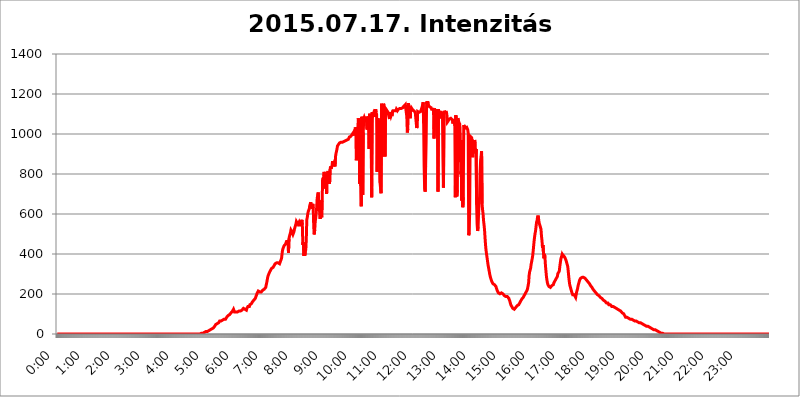
| Category | 2015.07.17. Intenzitás [W/m^2] |
|---|---|
| 0.0 | 0 |
| 0.0006944444444444445 | 0 |
| 0.001388888888888889 | 0 |
| 0.0020833333333333333 | 0 |
| 0.002777777777777778 | 0 |
| 0.003472222222222222 | 0 |
| 0.004166666666666667 | 0 |
| 0.004861111111111111 | 0 |
| 0.005555555555555556 | 0 |
| 0.0062499999999999995 | 0 |
| 0.006944444444444444 | 0 |
| 0.007638888888888889 | 0 |
| 0.008333333333333333 | 0 |
| 0.009027777777777779 | 0 |
| 0.009722222222222222 | 0 |
| 0.010416666666666666 | 0 |
| 0.011111111111111112 | 0 |
| 0.011805555555555555 | 0 |
| 0.012499999999999999 | 0 |
| 0.013194444444444444 | 0 |
| 0.013888888888888888 | 0 |
| 0.014583333333333332 | 0 |
| 0.015277777777777777 | 0 |
| 0.015972222222222224 | 0 |
| 0.016666666666666666 | 0 |
| 0.017361111111111112 | 0 |
| 0.018055555555555557 | 0 |
| 0.01875 | 0 |
| 0.019444444444444445 | 0 |
| 0.02013888888888889 | 0 |
| 0.020833333333333332 | 0 |
| 0.02152777777777778 | 0 |
| 0.022222222222222223 | 0 |
| 0.02291666666666667 | 0 |
| 0.02361111111111111 | 0 |
| 0.024305555555555556 | 0 |
| 0.024999999999999998 | 0 |
| 0.025694444444444447 | 0 |
| 0.02638888888888889 | 0 |
| 0.027083333333333334 | 0 |
| 0.027777777777777776 | 0 |
| 0.02847222222222222 | 0 |
| 0.029166666666666664 | 0 |
| 0.029861111111111113 | 0 |
| 0.030555555555555555 | 0 |
| 0.03125 | 0 |
| 0.03194444444444445 | 0 |
| 0.03263888888888889 | 0 |
| 0.03333333333333333 | 0 |
| 0.034027777777777775 | 0 |
| 0.034722222222222224 | 0 |
| 0.035416666666666666 | 0 |
| 0.036111111111111115 | 0 |
| 0.03680555555555556 | 0 |
| 0.0375 | 0 |
| 0.03819444444444444 | 0 |
| 0.03888888888888889 | 0 |
| 0.03958333333333333 | 0 |
| 0.04027777777777778 | 0 |
| 0.04097222222222222 | 0 |
| 0.041666666666666664 | 0 |
| 0.042361111111111106 | 0 |
| 0.04305555555555556 | 0 |
| 0.043750000000000004 | 0 |
| 0.044444444444444446 | 0 |
| 0.04513888888888889 | 0 |
| 0.04583333333333334 | 0 |
| 0.04652777777777778 | 0 |
| 0.04722222222222222 | 0 |
| 0.04791666666666666 | 0 |
| 0.04861111111111111 | 0 |
| 0.049305555555555554 | 0 |
| 0.049999999999999996 | 0 |
| 0.05069444444444445 | 0 |
| 0.051388888888888894 | 0 |
| 0.052083333333333336 | 0 |
| 0.05277777777777778 | 0 |
| 0.05347222222222222 | 0 |
| 0.05416666666666667 | 0 |
| 0.05486111111111111 | 0 |
| 0.05555555555555555 | 0 |
| 0.05625 | 0 |
| 0.05694444444444444 | 0 |
| 0.057638888888888885 | 0 |
| 0.05833333333333333 | 0 |
| 0.05902777777777778 | 0 |
| 0.059722222222222225 | 0 |
| 0.06041666666666667 | 0 |
| 0.061111111111111116 | 0 |
| 0.06180555555555556 | 0 |
| 0.0625 | 0 |
| 0.06319444444444444 | 0 |
| 0.06388888888888888 | 0 |
| 0.06458333333333334 | 0 |
| 0.06527777777777778 | 0 |
| 0.06597222222222222 | 0 |
| 0.06666666666666667 | 0 |
| 0.06736111111111111 | 0 |
| 0.06805555555555555 | 0 |
| 0.06874999999999999 | 0 |
| 0.06944444444444443 | 0 |
| 0.07013888888888889 | 0 |
| 0.07083333333333333 | 0 |
| 0.07152777777777779 | 0 |
| 0.07222222222222223 | 0 |
| 0.07291666666666667 | 0 |
| 0.07361111111111111 | 0 |
| 0.07430555555555556 | 0 |
| 0.075 | 0 |
| 0.07569444444444444 | 0 |
| 0.0763888888888889 | 0 |
| 0.07708333333333334 | 0 |
| 0.07777777777777778 | 0 |
| 0.07847222222222222 | 0 |
| 0.07916666666666666 | 0 |
| 0.0798611111111111 | 0 |
| 0.08055555555555556 | 0 |
| 0.08125 | 0 |
| 0.08194444444444444 | 0 |
| 0.08263888888888889 | 0 |
| 0.08333333333333333 | 0 |
| 0.08402777777777777 | 0 |
| 0.08472222222222221 | 0 |
| 0.08541666666666665 | 0 |
| 0.08611111111111112 | 0 |
| 0.08680555555555557 | 0 |
| 0.08750000000000001 | 0 |
| 0.08819444444444445 | 0 |
| 0.08888888888888889 | 0 |
| 0.08958333333333333 | 0 |
| 0.09027777777777778 | 0 |
| 0.09097222222222222 | 0 |
| 0.09166666666666667 | 0 |
| 0.09236111111111112 | 0 |
| 0.09305555555555556 | 0 |
| 0.09375 | 0 |
| 0.09444444444444444 | 0 |
| 0.09513888888888888 | 0 |
| 0.09583333333333333 | 0 |
| 0.09652777777777777 | 0 |
| 0.09722222222222222 | 0 |
| 0.09791666666666667 | 0 |
| 0.09861111111111111 | 0 |
| 0.09930555555555555 | 0 |
| 0.09999999999999999 | 0 |
| 0.10069444444444443 | 0 |
| 0.1013888888888889 | 0 |
| 0.10208333333333335 | 0 |
| 0.10277777777777779 | 0 |
| 0.10347222222222223 | 0 |
| 0.10416666666666667 | 0 |
| 0.10486111111111111 | 0 |
| 0.10555555555555556 | 0 |
| 0.10625 | 0 |
| 0.10694444444444444 | 0 |
| 0.1076388888888889 | 0 |
| 0.10833333333333334 | 0 |
| 0.10902777777777778 | 0 |
| 0.10972222222222222 | 0 |
| 0.1111111111111111 | 0 |
| 0.11180555555555556 | 0 |
| 0.11180555555555556 | 0 |
| 0.1125 | 0 |
| 0.11319444444444444 | 0 |
| 0.11388888888888889 | 0 |
| 0.11458333333333333 | 0 |
| 0.11527777777777777 | 0 |
| 0.11597222222222221 | 0 |
| 0.11666666666666665 | 0 |
| 0.1173611111111111 | 0 |
| 0.11805555555555557 | 0 |
| 0.11944444444444445 | 0 |
| 0.12013888888888889 | 0 |
| 0.12083333333333333 | 0 |
| 0.12152777777777778 | 0 |
| 0.12222222222222223 | 0 |
| 0.12291666666666667 | 0 |
| 0.12291666666666667 | 0 |
| 0.12361111111111112 | 0 |
| 0.12430555555555556 | 0 |
| 0.125 | 0 |
| 0.12569444444444444 | 0 |
| 0.12638888888888888 | 0 |
| 0.12708333333333333 | 0 |
| 0.16875 | 0 |
| 0.12847222222222224 | 0 |
| 0.12916666666666668 | 0 |
| 0.12986111111111112 | 0 |
| 0.13055555555555556 | 0 |
| 0.13125 | 0 |
| 0.13194444444444445 | 0 |
| 0.1326388888888889 | 0 |
| 0.13333333333333333 | 0 |
| 0.13402777777777777 | 0 |
| 0.13402777777777777 | 0 |
| 0.13472222222222222 | 0 |
| 0.13541666666666666 | 0 |
| 0.1361111111111111 | 0 |
| 0.13749999999999998 | 0 |
| 0.13819444444444443 | 0 |
| 0.1388888888888889 | 0 |
| 0.13958333333333334 | 0 |
| 0.14027777777777778 | 0 |
| 0.14097222222222222 | 0 |
| 0.14166666666666666 | 0 |
| 0.1423611111111111 | 0 |
| 0.14305555555555557 | 0 |
| 0.14375000000000002 | 0 |
| 0.14444444444444446 | 0 |
| 0.1451388888888889 | 0 |
| 0.1451388888888889 | 0 |
| 0.14652777777777778 | 0 |
| 0.14722222222222223 | 0 |
| 0.14791666666666667 | 0 |
| 0.1486111111111111 | 0 |
| 0.14930555555555555 | 0 |
| 0.15 | 0 |
| 0.15069444444444444 | 0 |
| 0.15138888888888888 | 0 |
| 0.15208333333333332 | 0 |
| 0.15277777777777776 | 0 |
| 0.15347222222222223 | 0 |
| 0.15416666666666667 | 0 |
| 0.15486111111111112 | 0 |
| 0.15555555555555556 | 0 |
| 0.15625 | 0 |
| 0.15694444444444444 | 0 |
| 0.15763888888888888 | 0 |
| 0.15833333333333333 | 0 |
| 0.15902777777777777 | 0 |
| 0.15972222222222224 | 0 |
| 0.16041666666666668 | 0 |
| 0.16111111111111112 | 0 |
| 0.16180555555555556 | 0 |
| 0.1625 | 0 |
| 0.16319444444444445 | 0 |
| 0.1638888888888889 | 0 |
| 0.16458333333333333 | 0 |
| 0.16527777777777777 | 0 |
| 0.16597222222222222 | 0 |
| 0.16666666666666666 | 0 |
| 0.1673611111111111 | 0 |
| 0.16805555555555554 | 0 |
| 0.16874999999999998 | 0 |
| 0.16944444444444443 | 0 |
| 0.17013888888888887 | 0 |
| 0.1708333333333333 | 0 |
| 0.17152777777777775 | 0 |
| 0.17222222222222225 | 0 |
| 0.1729166666666667 | 0 |
| 0.17361111111111113 | 0 |
| 0.17430555555555557 | 0 |
| 0.17500000000000002 | 0 |
| 0.17569444444444446 | 0 |
| 0.1763888888888889 | 0 |
| 0.17708333333333334 | 0 |
| 0.17777777777777778 | 0 |
| 0.17847222222222223 | 0 |
| 0.17916666666666667 | 0 |
| 0.1798611111111111 | 0 |
| 0.18055555555555555 | 0 |
| 0.18125 | 0 |
| 0.18194444444444444 | 0 |
| 0.1826388888888889 | 0 |
| 0.18333333333333335 | 0 |
| 0.1840277777777778 | 0 |
| 0.18472222222222223 | 0 |
| 0.18541666666666667 | 0 |
| 0.18611111111111112 | 0 |
| 0.18680555555555556 | 0 |
| 0.1875 | 0 |
| 0.18819444444444444 | 0 |
| 0.18888888888888888 | 0 |
| 0.18958333333333333 | 0 |
| 0.19027777777777777 | 0 |
| 0.1909722222222222 | 0 |
| 0.19166666666666665 | 0 |
| 0.19236111111111112 | 0 |
| 0.19305555555555554 | 0 |
| 0.19375 | 0 |
| 0.19444444444444445 | 0 |
| 0.1951388888888889 | 0 |
| 0.19583333333333333 | 0 |
| 0.19652777777777777 | 0 |
| 0.19722222222222222 | 0 |
| 0.19791666666666666 | 0 |
| 0.1986111111111111 | 0 |
| 0.19930555555555554 | 0 |
| 0.19999999999999998 | 0 |
| 0.20069444444444443 | 0 |
| 0.20138888888888887 | 3.525 |
| 0.2020833333333333 | 3.525 |
| 0.2027777777777778 | 3.525 |
| 0.2034722222222222 | 3.525 |
| 0.2041666666666667 | 3.525 |
| 0.20486111111111113 | 3.525 |
| 0.20555555555555557 | 7.887 |
| 0.20625000000000002 | 7.887 |
| 0.20694444444444446 | 7.887 |
| 0.2076388888888889 | 7.887 |
| 0.20833333333333334 | 12.257 |
| 0.20902777777777778 | 12.257 |
| 0.20972222222222223 | 12.257 |
| 0.21041666666666667 | 12.257 |
| 0.2111111111111111 | 16.636 |
| 0.21180555555555555 | 16.636 |
| 0.2125 | 16.636 |
| 0.21319444444444444 | 16.636 |
| 0.2138888888888889 | 21.024 |
| 0.21458333333333335 | 21.024 |
| 0.2152777777777778 | 21.024 |
| 0.21597222222222223 | 21.024 |
| 0.21666666666666667 | 25.419 |
| 0.21736111111111112 | 25.419 |
| 0.21805555555555556 | 29.823 |
| 0.21875 | 29.823 |
| 0.21944444444444444 | 34.234 |
| 0.22013888888888888 | 34.234 |
| 0.22083333333333333 | 38.653 |
| 0.22152777777777777 | 43.079 |
| 0.2222222222222222 | 47.511 |
| 0.22291666666666665 | 47.511 |
| 0.2236111111111111 | 47.511 |
| 0.22430555555555556 | 51.951 |
| 0.225 | 51.951 |
| 0.22569444444444445 | 56.398 |
| 0.2263888888888889 | 56.398 |
| 0.22708333333333333 | 60.85 |
| 0.22777777777777777 | 65.31 |
| 0.22847222222222222 | 65.31 |
| 0.22916666666666666 | 65.31 |
| 0.2298611111111111 | 65.31 |
| 0.23055555555555554 | 65.31 |
| 0.23124999999999998 | 65.31 |
| 0.23194444444444443 | 69.775 |
| 0.23263888888888887 | 69.775 |
| 0.2333333333333333 | 69.775 |
| 0.2340277777777778 | 74.246 |
| 0.2347222222222222 | 74.246 |
| 0.2354166666666667 | 74.246 |
| 0.23611111111111113 | 74.246 |
| 0.23680555555555557 | 78.722 |
| 0.23750000000000002 | 83.205 |
| 0.23819444444444446 | 83.205 |
| 0.2388888888888889 | 87.692 |
| 0.23958333333333334 | 92.184 |
| 0.24027777777777778 | 92.184 |
| 0.24097222222222223 | 92.184 |
| 0.24166666666666667 | 96.682 |
| 0.2423611111111111 | 96.682 |
| 0.24305555555555555 | 101.184 |
| 0.24375 | 105.69 |
| 0.24444444444444446 | 105.69 |
| 0.24513888888888888 | 110.201 |
| 0.24583333333333335 | 114.716 |
| 0.2465277777777778 | 119.235 |
| 0.24722222222222223 | 123.758 |
| 0.24791666666666667 | 119.235 |
| 0.24861111111111112 | 110.201 |
| 0.24930555555555556 | 114.716 |
| 0.25 | 114.716 |
| 0.25069444444444444 | 110.201 |
| 0.2513888888888889 | 114.716 |
| 0.2520833333333333 | 114.716 |
| 0.25277777777777777 | 110.201 |
| 0.2534722222222222 | 110.201 |
| 0.25416666666666665 | 114.716 |
| 0.2548611111111111 | 114.716 |
| 0.2555555555555556 | 114.716 |
| 0.25625000000000003 | 114.716 |
| 0.2569444444444445 | 114.716 |
| 0.2576388888888889 | 114.716 |
| 0.25833333333333336 | 114.716 |
| 0.2590277777777778 | 119.235 |
| 0.25972222222222224 | 119.235 |
| 0.2604166666666667 | 123.758 |
| 0.2611111111111111 | 128.284 |
| 0.26180555555555557 | 128.284 |
| 0.2625 | 128.284 |
| 0.26319444444444445 | 123.758 |
| 0.2638888888888889 | 119.235 |
| 0.26458333333333334 | 119.235 |
| 0.2652777777777778 | 119.235 |
| 0.2659722222222222 | 128.284 |
| 0.26666666666666666 | 132.814 |
| 0.2673611111111111 | 137.347 |
| 0.26805555555555555 | 137.347 |
| 0.26875 | 137.347 |
| 0.26944444444444443 | 137.347 |
| 0.2701388888888889 | 146.423 |
| 0.2708333333333333 | 146.423 |
| 0.27152777777777776 | 146.423 |
| 0.2722222222222222 | 150.964 |
| 0.27291666666666664 | 155.509 |
| 0.2736111111111111 | 160.056 |
| 0.2743055555555555 | 164.605 |
| 0.27499999999999997 | 164.605 |
| 0.27569444444444446 | 169.156 |
| 0.27638888888888885 | 173.709 |
| 0.27708333333333335 | 173.709 |
| 0.2777777777777778 | 178.264 |
| 0.27847222222222223 | 182.82 |
| 0.2791666666666667 | 191.937 |
| 0.2798611111111111 | 196.497 |
| 0.28055555555555556 | 205.62 |
| 0.28125 | 210.182 |
| 0.28194444444444444 | 214.746 |
| 0.2826388888888889 | 214.746 |
| 0.2833333333333333 | 214.746 |
| 0.28402777777777777 | 210.182 |
| 0.2847222222222222 | 205.62 |
| 0.28541666666666665 | 205.62 |
| 0.28611111111111115 | 210.182 |
| 0.28680555555555554 | 210.182 |
| 0.28750000000000003 | 210.182 |
| 0.2881944444444445 | 219.309 |
| 0.2888888888888889 | 219.309 |
| 0.28958333333333336 | 219.309 |
| 0.2902777777777778 | 223.873 |
| 0.29097222222222224 | 223.873 |
| 0.2916666666666667 | 223.873 |
| 0.2923611111111111 | 233 |
| 0.29305555555555557 | 233 |
| 0.29375 | 255.813 |
| 0.29444444444444445 | 269.49 |
| 0.2951388888888889 | 283.156 |
| 0.29583333333333334 | 292.259 |
| 0.2965277777777778 | 296.808 |
| 0.2972222222222222 | 287.709 |
| 0.29791666666666666 | 310.44 |
| 0.2986111111111111 | 314.98 |
| 0.29930555555555555 | 319.517 |
| 0.3 | 319.517 |
| 0.30069444444444443 | 328.584 |
| 0.3013888888888889 | 328.584 |
| 0.3020833333333333 | 333.113 |
| 0.30277777777777776 | 333.113 |
| 0.3034722222222222 | 337.639 |
| 0.30416666666666664 | 342.162 |
| 0.3048611111111111 | 346.682 |
| 0.3055555555555555 | 351.198 |
| 0.30624999999999997 | 351.198 |
| 0.3069444444444444 | 355.712 |
| 0.3076388888888889 | 355.712 |
| 0.30833333333333335 | 351.198 |
| 0.3090277777777778 | 351.198 |
| 0.30972222222222223 | 355.712 |
| 0.3104166666666667 | 355.712 |
| 0.3111111111111111 | 355.712 |
| 0.31180555555555556 | 351.198 |
| 0.3125 | 355.712 |
| 0.31319444444444444 | 364.728 |
| 0.3138888888888889 | 364.728 |
| 0.3145833333333333 | 378.224 |
| 0.31527777777777777 | 400.638 |
| 0.3159722222222222 | 418.492 |
| 0.31666666666666665 | 427.39 |
| 0.31736111111111115 | 431.833 |
| 0.31805555555555554 | 440.702 |
| 0.31875000000000003 | 440.702 |
| 0.3194444444444445 | 445.129 |
| 0.3201388888888889 | 449.551 |
| 0.32083333333333336 | 453.968 |
| 0.3215277777777778 | 462.786 |
| 0.32222222222222224 | 462.786 |
| 0.3229166666666667 | 467.187 |
| 0.3236111111111111 | 462.786 |
| 0.32430555555555557 | 405.108 |
| 0.325 | 475.972 |
| 0.32569444444444445 | 489.108 |
| 0.3263888888888889 | 484.735 |
| 0.32708333333333334 | 506.542 |
| 0.3277777777777778 | 519.555 |
| 0.3284722222222222 | 519.555 |
| 0.32916666666666666 | 510.885 |
| 0.3298611111111111 | 506.542 |
| 0.33055555555555555 | 497.836 |
| 0.33125 | 502.192 |
| 0.33194444444444443 | 510.885 |
| 0.3326388888888889 | 523.88 |
| 0.3333333333333333 | 532.513 |
| 0.3340277777777778 | 541.121 |
| 0.3347222222222222 | 549.704 |
| 0.3354166666666667 | 562.53 |
| 0.3361111111111111 | 562.53 |
| 0.3368055555555556 | 566.793 |
| 0.33749999999999997 | 549.704 |
| 0.33819444444444446 | 549.704 |
| 0.33888888888888885 | 558.261 |
| 0.33958333333333335 | 545.416 |
| 0.34027777777777773 | 545.416 |
| 0.34097222222222223 | 541.121 |
| 0.3416666666666666 | 545.416 |
| 0.3423611111111111 | 558.261 |
| 0.3430555555555555 | 571.049 |
| 0.34375 | 545.416 |
| 0.3444444444444445 | 445.129 |
| 0.3451388888888889 | 458.38 |
| 0.3458333333333334 | 391.685 |
| 0.34652777777777777 | 400.638 |
| 0.34722222222222227 | 391.685 |
| 0.34791666666666665 | 409.574 |
| 0.34861111111111115 | 422.943 |
| 0.34930555555555554 | 475.972 |
| 0.35000000000000003 | 571.049 |
| 0.3506944444444444 | 583.779 |
| 0.3513888888888889 | 600.661 |
| 0.3520833333333333 | 613.252 |
| 0.3527777777777778 | 613.252 |
| 0.3534722222222222 | 625.784 |
| 0.3541666666666667 | 642.4 |
| 0.3548611111111111 | 642.4 |
| 0.35555555555555557 | 658.909 |
| 0.35625 | 634.105 |
| 0.35694444444444445 | 642.4 |
| 0.3576388888888889 | 625.784 |
| 0.35833333333333334 | 650.667 |
| 0.3590277777777778 | 629.948 |
| 0.3597222222222222 | 536.82 |
| 0.36041666666666666 | 497.836 |
| 0.3611111111111111 | 519.555 |
| 0.36180555555555555 | 562.53 |
| 0.3625 | 579.542 |
| 0.36319444444444443 | 604.864 |
| 0.3638888888888889 | 634.105 |
| 0.3645833333333333 | 679.395 |
| 0.3652777777777778 | 675.311 |
| 0.3659722222222222 | 707.8 |
| 0.3666666666666667 | 667.123 |
| 0.3673611111111111 | 634.105 |
| 0.3680555555555556 | 609.062 |
| 0.36874999999999997 | 575.299 |
| 0.36944444444444446 | 667.123 |
| 0.37013888888888885 | 671.22 |
| 0.37083333333333335 | 583.779 |
| 0.37152777777777773 | 663.019 |
| 0.37222222222222223 | 775.492 |
| 0.3729166666666666 | 775.492 |
| 0.3736111111111111 | 783.342 |
| 0.3743055555555555 | 810.641 |
| 0.375 | 771.559 |
| 0.3756944444444445 | 727.896 |
| 0.3763888888888889 | 798.974 |
| 0.3770833333333334 | 759.723 |
| 0.37777777777777777 | 699.717 |
| 0.37847222222222227 | 798.974 |
| 0.37916666666666665 | 806.757 |
| 0.37986111111111115 | 814.519 |
| 0.38055555555555554 | 751.803 |
| 0.38125000000000003 | 802.868 |
| 0.3819444444444444 | 751.803 |
| 0.3826388888888889 | 822.26 |
| 0.3833333333333333 | 837.682 |
| 0.3840277777777778 | 826.123 |
| 0.3847222222222222 | 833.834 |
| 0.3854166666666667 | 841.526 |
| 0.3861111111111111 | 864.493 |
| 0.38680555555555557 | 864.493 |
| 0.3875 | 853.029 |
| 0.38819444444444445 | 849.199 |
| 0.3888888888888889 | 849.199 |
| 0.38958333333333334 | 837.682 |
| 0.3902777777777778 | 887.309 |
| 0.3909722222222222 | 902.447 |
| 0.39166666666666666 | 913.766 |
| 0.3923611111111111 | 925.06 |
| 0.39305555555555555 | 940.082 |
| 0.39375 | 943.832 |
| 0.39444444444444443 | 947.58 |
| 0.3951388888888889 | 951.327 |
| 0.3958333333333333 | 955.071 |
| 0.3965277777777778 | 955.071 |
| 0.3972222222222222 | 958.814 |
| 0.3979166666666667 | 958.814 |
| 0.3986111111111111 | 958.814 |
| 0.3993055555555556 | 958.814 |
| 0.39999999999999997 | 958.814 |
| 0.40069444444444446 | 962.555 |
| 0.40138888888888885 | 962.555 |
| 0.40208333333333335 | 962.555 |
| 0.40277777777777773 | 962.555 |
| 0.40347222222222223 | 962.555 |
| 0.4041666666666666 | 966.295 |
| 0.4048611111111111 | 966.295 |
| 0.4055555555555555 | 970.034 |
| 0.40625 | 970.034 |
| 0.4069444444444445 | 970.034 |
| 0.4076388888888889 | 973.772 |
| 0.4083333333333334 | 973.772 |
| 0.40902777777777777 | 977.508 |
| 0.40972222222222227 | 984.98 |
| 0.41041666666666665 | 984.98 |
| 0.41111111111111115 | 988.714 |
| 0.41180555555555554 | 988.714 |
| 0.41250000000000003 | 992.448 |
| 0.4131944444444444 | 992.448 |
| 0.4138888888888889 | 999.916 |
| 0.4145833333333333 | 999.916 |
| 0.4152777777777778 | 1007.383 |
| 0.4159722222222222 | 1007.383 |
| 0.4166666666666667 | 992.448 |
| 0.4173611111111111 | 1014.852 |
| 0.41805555555555557 | 1033.537 |
| 0.41875 | 1026.06 |
| 0.41944444444444445 | 868.305 |
| 0.4201388888888889 | 894.885 |
| 0.42083333333333334 | 992.448 |
| 0.4215277777777778 | 1007.383 |
| 0.4222222222222222 | 1078.555 |
| 0.42291666666666666 | 1059.756 |
| 0.4236111111111111 | 1071.027 |
| 0.42430555555555555 | 751.803 |
| 0.425 | 1056.004 |
| 0.42569444444444443 | 739.877 |
| 0.4263888888888889 | 638.256 |
| 0.4270833333333333 | 1086.097 |
| 0.4277777777777778 | 1067.267 |
| 0.4284722222222222 | 695.666 |
| 0.4291666666666667 | 1007.383 |
| 0.4298611111111111 | 1074.789 |
| 0.4305555555555556 | 1082.324 |
| 0.43124999999999997 | 1074.789 |
| 0.43194444444444446 | 1074.789 |
| 0.43263888888888885 | 1059.756 |
| 0.43333333333333335 | 1086.097 |
| 0.43402777777777773 | 1082.324 |
| 0.43472222222222223 | 1022.323 |
| 0.4354166666666666 | 1086.097 |
| 0.4361111111111111 | 1074.789 |
| 0.4368055555555555 | 1086.097 |
| 0.4375 | 925.06 |
| 0.4381944444444445 | 1101.226 |
| 0.4388888888888889 | 977.508 |
| 0.4395833333333334 | 1048.508 |
| 0.44027777777777777 | 1071.027 |
| 0.44097222222222227 | 683.473 |
| 0.44166666666666665 | 1108.816 |
| 0.44236111111111115 | 1105.019 |
| 0.44305555555555554 | 1097.437 |
| 0.44375000000000003 | 1105.019 |
| 0.4444444444444444 | 1108.816 |
| 0.4451388888888889 | 1105.019 |
| 0.4458333333333333 | 1086.097 |
| 0.4465277777777778 | 1124.056 |
| 0.4472222222222222 | 1108.816 |
| 0.4479166666666667 | 1097.437 |
| 0.4486111111111111 | 810.641 |
| 0.44930555555555557 | 1041.019 |
| 0.45 | 1078.555 |
| 0.45069444444444445 | 1056.004 |
| 0.4513888888888889 | 864.493 |
| 0.45208333333333334 | 1014.852 |
| 0.4527777777777778 | 755.766 |
| 0.4534722222222222 | 727.896 |
| 0.45416666666666666 | 703.762 |
| 0.4548611111111111 | 1150.946 |
| 0.45555555555555555 | 887.309 |
| 0.45625 | 1048.508 |
| 0.45694444444444443 | 1139.384 |
| 0.4576388888888889 | 1150.946 |
| 0.4583333333333333 | 1143.232 |
| 0.4590277777777778 | 1135.543 |
| 0.4597222222222222 | 887.309 |
| 0.4604166666666667 | 1127.879 |
| 0.4611111111111111 | 1124.056 |
| 0.4618055555555556 | 1101.226 |
| 0.46249999999999997 | 1116.426 |
| 0.46319444444444446 | 1112.618 |
| 0.46388888888888885 | 1108.816 |
| 0.46458333333333335 | 1108.816 |
| 0.46527777777777773 | 1105.019 |
| 0.46597222222222223 | 1074.789 |
| 0.4666666666666666 | 1108.816 |
| 0.4673611111111111 | 1112.618 |
| 0.4680555555555555 | 1089.873 |
| 0.46875 | 1097.437 |
| 0.4694444444444445 | 1089.873 |
| 0.4701388888888889 | 1108.816 |
| 0.4708333333333334 | 1116.426 |
| 0.47152777777777777 | 1116.426 |
| 0.47222222222222227 | 1116.426 |
| 0.47291666666666665 | 1116.426 |
| 0.47361111111111115 | 1112.618 |
| 0.47430555555555554 | 1112.618 |
| 0.47500000000000003 | 1116.426 |
| 0.4756944444444444 | 1124.056 |
| 0.4763888888888889 | 1120.238 |
| 0.4770833333333333 | 1116.426 |
| 0.4777777777777778 | 1116.426 |
| 0.4784722222222222 | 1124.056 |
| 0.4791666666666667 | 1124.056 |
| 0.4798611111111111 | 1124.056 |
| 0.48055555555555557 | 1127.879 |
| 0.48125 | 1131.708 |
| 0.48194444444444445 | 1131.708 |
| 0.4826388888888889 | 1127.879 |
| 0.48333333333333334 | 1131.708 |
| 0.4840277777777778 | 1131.708 |
| 0.4847222222222222 | 1131.708 |
| 0.48541666666666666 | 1135.543 |
| 0.4861111111111111 | 1139.384 |
| 0.48680555555555555 | 1139.384 |
| 0.4875 | 1143.232 |
| 0.48819444444444443 | 1147.086 |
| 0.4888888888888889 | 1147.086 |
| 0.4895833333333333 | 1150.946 |
| 0.4902777777777778 | 1086.097 |
| 0.4909722222222222 | 1007.383 |
| 0.4916666666666667 | 1026.06 |
| 0.4923611111111111 | 1154.814 |
| 0.4930555555555556 | 1131.708 |
| 0.49374999999999997 | 1120.238 |
| 0.49444444444444446 | 1105.019 |
| 0.49513888888888885 | 1078.555 |
| 0.49583333333333335 | 1124.056 |
| 0.49652777777777773 | 1131.708 |
| 0.49722222222222223 | 1131.708 |
| 0.4979166666666666 | 1124.056 |
| 0.4986111111111111 | 1120.238 |
| 0.4993055555555555 | 1120.238 |
| 0.5 | 1116.426 |
| 0.5006944444444444 | 1112.618 |
| 0.5013888888888889 | 1116.426 |
| 0.5020833333333333 | 1108.816 |
| 0.5027777777777778 | 1108.816 |
| 0.5034722222222222 | 1105.019 |
| 0.5041666666666667 | 1029.798 |
| 0.5048611111111111 | 1041.019 |
| 0.5055555555555555 | 1112.618 |
| 0.50625 | 1116.426 |
| 0.5069444444444444 | 1112.618 |
| 0.5076388888888889 | 1108.816 |
| 0.5083333333333333 | 1108.816 |
| 0.5090277777777777 | 1112.618 |
| 0.5097222222222222 | 1112.618 |
| 0.5104166666666666 | 1112.618 |
| 0.5111111111111112 | 1127.879 |
| 0.5118055555555555 | 1135.543 |
| 0.5125000000000001 | 1135.543 |
| 0.5131944444444444 | 1158.689 |
| 0.513888888888889 | 1052.255 |
| 0.5145833333333333 | 837.682 |
| 0.5152777777777778 | 727.896 |
| 0.5159722222222222 | 711.832 |
| 0.5166666666666667 | 837.682 |
| 0.517361111111111 | 962.555 |
| 0.5180555555555556 | 1162.571 |
| 0.5187499999999999 | 1150.946 |
| 0.5194444444444445 | 1162.571 |
| 0.5201388888888888 | 1154.814 |
| 0.5208333333333334 | 1143.232 |
| 0.5215277777777778 | 1139.384 |
| 0.5222222222222223 | 1135.543 |
| 0.5229166666666667 | 1135.543 |
| 0.5236111111111111 | 1139.384 |
| 0.5243055555555556 | 1131.708 |
| 0.525 | 1124.056 |
| 0.5256944444444445 | 1127.879 |
| 0.5263888888888889 | 1124.056 |
| 0.5270833333333333 | 1124.056 |
| 0.5277777777777778 | 1116.426 |
| 0.5284722222222222 | 977.508 |
| 0.5291666666666667 | 1127.879 |
| 0.5298611111111111 | 1097.437 |
| 0.5305555555555556 | 1124.056 |
| 0.53125 | 1097.437 |
| 0.5319444444444444 | 1067.267 |
| 0.5326388888888889 | 999.916 |
| 0.5333333333333333 | 988.714 |
| 0.5340277777777778 | 711.832 |
| 0.5347222222222222 | 1124.056 |
| 0.5354166666666667 | 1127.879 |
| 0.5361111111111111 | 1078.555 |
| 0.5368055555555555 | 1108.816 |
| 0.5375 | 1108.816 |
| 0.5381944444444444 | 1112.618 |
| 0.5388888888888889 | 1108.816 |
| 0.5395833333333333 | 1105.019 |
| 0.5402777777777777 | 1101.226 |
| 0.5409722222222222 | 872.114 |
| 0.5416666666666666 | 731.896 |
| 0.5423611111111112 | 1097.437 |
| 0.5430555555555555 | 1116.426 |
| 0.5437500000000001 | 1108.816 |
| 0.5444444444444444 | 1105.019 |
| 0.545138888888889 | 1105.019 |
| 0.5458333333333333 | 1108.816 |
| 0.5465277777777778 | 1093.653 |
| 0.5472222222222222 | 1059.756 |
| 0.5479166666666667 | 1059.756 |
| 0.548611111111111 | 1067.267 |
| 0.5493055555555556 | 1063.51 |
| 0.5499999999999999 | 1074.789 |
| 0.5506944444444445 | 1078.555 |
| 0.5513888888888888 | 1078.555 |
| 0.5520833333333334 | 1078.555 |
| 0.5527777777777778 | 1074.789 |
| 0.5534722222222223 | 1074.789 |
| 0.5541666666666667 | 1071.027 |
| 0.5548611111111111 | 1052.255 |
| 0.5555555555555556 | 1059.756 |
| 0.55625 | 1063.51 |
| 0.5569444444444445 | 1074.789 |
| 0.5576388888888889 | 1041.019 |
| 0.5583333333333333 | 683.473 |
| 0.5590277777777778 | 1093.653 |
| 0.5597222222222222 | 1041.019 |
| 0.5604166666666667 | 687.544 |
| 0.5611111111111111 | 719.877 |
| 0.5618055555555556 | 1078.555 |
| 0.5625 | 1071.027 |
| 0.5631944444444444 | 1059.756 |
| 0.5638888888888889 | 1059.756 |
| 0.5645833333333333 | 1048.508 |
| 0.5652777777777778 | 984.98 |
| 0.5659722222222222 | 798.974 |
| 0.5666666666666667 | 814.519 |
| 0.5673611111111111 | 667.123 |
| 0.5680555555555555 | 970.034 |
| 0.56875 | 634.105 |
| 0.5694444444444444 | 683.473 |
| 0.5701388888888889 | 1044.762 |
| 0.5708333333333333 | 1044.762 |
| 0.5715277777777777 | 1041.019 |
| 0.5722222222222222 | 1029.798 |
| 0.5729166666666666 | 1033.537 |
| 0.5736111111111112 | 1029.798 |
| 0.5743055555555555 | 1033.537 |
| 0.5750000000000001 | 1029.798 |
| 0.5756944444444444 | 1022.323 |
| 0.576388888888889 | 1003.65 |
| 0.5770833333333333 | 493.475 |
| 0.5777777777777778 | 506.542 |
| 0.5784722222222222 | 621.613 |
| 0.5791666666666667 | 988.714 |
| 0.579861111111111 | 992.448 |
| 0.5805555555555556 | 988.714 |
| 0.5812499999999999 | 981.244 |
| 0.5819444444444445 | 940.082 |
| 0.5826388888888888 | 883.516 |
| 0.5833333333333334 | 962.555 |
| 0.5840277777777778 | 966.295 |
| 0.5847222222222223 | 955.071 |
| 0.5854166666666667 | 970.034 |
| 0.5861111111111111 | 951.327 |
| 0.5868055555555556 | 902.447 |
| 0.5875 | 925.06 |
| 0.5881944444444445 | 646.537 |
| 0.5888888888888889 | 549.704 |
| 0.5895833333333333 | 515.223 |
| 0.5902777777777778 | 536.82 |
| 0.5909722222222222 | 609.062 |
| 0.5916666666666667 | 604.864 |
| 0.5923611111111111 | 687.544 |
| 0.5930555555555556 | 810.641 |
| 0.59375 | 868.305 |
| 0.5944444444444444 | 887.309 |
| 0.5951388888888889 | 913.766 |
| 0.5958333333333333 | 650.667 |
| 0.5965277777777778 | 621.613 |
| 0.5972222222222222 | 600.661 |
| 0.5979166666666667 | 566.793 |
| 0.5986111111111111 | 545.416 |
| 0.5993055555555555 | 519.555 |
| 0.6 | 480.356 |
| 0.6006944444444444 | 445.129 |
| 0.6013888888888889 | 418.492 |
| 0.6020833333333333 | 400.638 |
| 0.6027777777777777 | 382.715 |
| 0.6034722222222222 | 364.728 |
| 0.6041666666666666 | 346.682 |
| 0.6048611111111112 | 333.113 |
| 0.6055555555555555 | 319.517 |
| 0.6062500000000001 | 305.898 |
| 0.6069444444444444 | 292.259 |
| 0.607638888888889 | 283.156 |
| 0.6083333333333333 | 274.047 |
| 0.6090277777777778 | 269.49 |
| 0.6097222222222222 | 260.373 |
| 0.6104166666666667 | 255.813 |
| 0.611111111111111 | 251.251 |
| 0.6118055555555556 | 251.251 |
| 0.6124999999999999 | 251.251 |
| 0.6131944444444445 | 246.689 |
| 0.6138888888888888 | 242.127 |
| 0.6145833333333334 | 242.127 |
| 0.6152777777777778 | 237.564 |
| 0.6159722222222223 | 228.436 |
| 0.6166666666666667 | 223.873 |
| 0.6173611111111111 | 214.746 |
| 0.6180555555555556 | 210.182 |
| 0.61875 | 205.62 |
| 0.6194444444444445 | 205.62 |
| 0.6201388888888889 | 201.058 |
| 0.6208333333333333 | 201.058 |
| 0.6215277777777778 | 201.058 |
| 0.6222222222222222 | 205.62 |
| 0.6229166666666667 | 205.62 |
| 0.6236111111111111 | 205.62 |
| 0.6243055555555556 | 205.62 |
| 0.625 | 201.058 |
| 0.6256944444444444 | 201.058 |
| 0.6263888888888889 | 196.497 |
| 0.6270833333333333 | 191.937 |
| 0.6277777777777778 | 191.937 |
| 0.6284722222222222 | 191.937 |
| 0.6291666666666667 | 187.378 |
| 0.6298611111111111 | 187.378 |
| 0.6305555555555555 | 187.378 |
| 0.63125 | 187.378 |
| 0.6319444444444444 | 187.378 |
| 0.6326388888888889 | 182.82 |
| 0.6333333333333333 | 178.264 |
| 0.6340277777777777 | 173.709 |
| 0.6347222222222222 | 164.605 |
| 0.6354166666666666 | 155.509 |
| 0.6361111111111112 | 146.423 |
| 0.6368055555555555 | 141.884 |
| 0.6375000000000001 | 137.347 |
| 0.6381944444444444 | 132.814 |
| 0.638888888888889 | 128.284 |
| 0.6395833333333333 | 128.284 |
| 0.6402777777777778 | 128.284 |
| 0.6409722222222222 | 123.758 |
| 0.6416666666666667 | 128.284 |
| 0.642361111111111 | 128.284 |
| 0.6430555555555556 | 132.814 |
| 0.6437499999999999 | 137.347 |
| 0.6444444444444445 | 137.347 |
| 0.6451388888888888 | 141.884 |
| 0.6458333333333334 | 141.884 |
| 0.6465277777777778 | 146.423 |
| 0.6472222222222223 | 146.423 |
| 0.6479166666666667 | 150.964 |
| 0.6486111111111111 | 155.509 |
| 0.6493055555555556 | 160.056 |
| 0.65 | 164.605 |
| 0.6506944444444445 | 169.156 |
| 0.6513888888888889 | 173.709 |
| 0.6520833333333333 | 173.709 |
| 0.6527777777777778 | 178.264 |
| 0.6534722222222222 | 182.82 |
| 0.6541666666666667 | 187.378 |
| 0.6548611111111111 | 191.937 |
| 0.6555555555555556 | 196.497 |
| 0.65625 | 201.058 |
| 0.6569444444444444 | 205.62 |
| 0.6576388888888889 | 210.182 |
| 0.6583333333333333 | 214.746 |
| 0.6590277777777778 | 219.309 |
| 0.6597222222222222 | 228.436 |
| 0.6604166666666667 | 242.127 |
| 0.6611111111111111 | 255.813 |
| 0.6618055555555555 | 292.259 |
| 0.6625 | 310.44 |
| 0.6631944444444444 | 319.517 |
| 0.6638888888888889 | 328.584 |
| 0.6645833333333333 | 346.682 |
| 0.6652777777777777 | 360.221 |
| 0.6659722222222222 | 373.729 |
| 0.6666666666666666 | 387.202 |
| 0.6673611111111111 | 409.574 |
| 0.6680555555555556 | 436.27 |
| 0.6687500000000001 | 462.786 |
| 0.6694444444444444 | 484.735 |
| 0.6701388888888888 | 502.192 |
| 0.6708333333333334 | 515.223 |
| 0.6715277777777778 | 536.82 |
| 0.6722222222222222 | 558.261 |
| 0.6729166666666666 | 566.793 |
| 0.6736111111111112 | 583.779 |
| 0.6743055555555556 | 592.233 |
| 0.6749999999999999 | 579.542 |
| 0.6756944444444444 | 558.261 |
| 0.6763888888888889 | 553.986 |
| 0.6770833333333334 | 541.121 |
| 0.6777777777777777 | 532.513 |
| 0.6784722222222223 | 523.88 |
| 0.6791666666666667 | 489.108 |
| 0.6798611111111111 | 467.187 |
| 0.6805555555555555 | 431.833 |
| 0.68125 | 445.129 |
| 0.6819444444444445 | 405.108 |
| 0.6826388888888889 | 378.224 |
| 0.6833333333333332 | 400.638 |
| 0.6840277777777778 | 382.715 |
| 0.6847222222222222 | 342.162 |
| 0.6854166666666667 | 314.98 |
| 0.686111111111111 | 287.709 |
| 0.6868055555555556 | 269.49 |
| 0.6875 | 255.813 |
| 0.6881944444444444 | 246.689 |
| 0.688888888888889 | 242.127 |
| 0.6895833333333333 | 237.564 |
| 0.6902777777777778 | 233 |
| 0.6909722222222222 | 233 |
| 0.6916666666666668 | 233 |
| 0.6923611111111111 | 233 |
| 0.6930555555555555 | 237.564 |
| 0.69375 | 242.127 |
| 0.6944444444444445 | 242.127 |
| 0.6951388888888889 | 246.689 |
| 0.6958333333333333 | 246.689 |
| 0.6965277777777777 | 255.813 |
| 0.6972222222222223 | 260.373 |
| 0.6979166666666666 | 264.932 |
| 0.6986111111111111 | 269.49 |
| 0.6993055555555556 | 269.49 |
| 0.7000000000000001 | 278.603 |
| 0.7006944444444444 | 278.603 |
| 0.7013888888888888 | 287.709 |
| 0.7020833333333334 | 301.354 |
| 0.7027777777777778 | 296.808 |
| 0.7034722222222222 | 301.354 |
| 0.7041666666666666 | 314.98 |
| 0.7048611111111112 | 337.639 |
| 0.7055555555555556 | 355.712 |
| 0.7062499999999999 | 373.729 |
| 0.7069444444444444 | 378.224 |
| 0.7076388888888889 | 391.685 |
| 0.7083333333333334 | 382.715 |
| 0.7090277777777777 | 396.164 |
| 0.7097222222222223 | 391.685 |
| 0.7104166666666667 | 391.685 |
| 0.7111111111111111 | 387.202 |
| 0.7118055555555555 | 382.715 |
| 0.7125 | 378.224 |
| 0.7131944444444445 | 373.729 |
| 0.7138888888888889 | 364.728 |
| 0.7145833333333332 | 355.712 |
| 0.7152777777777778 | 346.682 |
| 0.7159722222222222 | 337.639 |
| 0.7166666666666667 | 314.98 |
| 0.717361111111111 | 287.709 |
| 0.7180555555555556 | 264.932 |
| 0.71875 | 246.689 |
| 0.7194444444444444 | 237.564 |
| 0.720138888888889 | 228.436 |
| 0.7208333333333333 | 219.309 |
| 0.7215277777777778 | 210.182 |
| 0.7222222222222222 | 205.62 |
| 0.7229166666666668 | 196.497 |
| 0.7236111111111111 | 196.497 |
| 0.7243055555555555 | 201.058 |
| 0.725 | 196.497 |
| 0.7256944444444445 | 201.058 |
| 0.7263888888888889 | 191.937 |
| 0.7270833333333333 | 182.82 |
| 0.7277777777777777 | 196.497 |
| 0.7284722222222223 | 210.182 |
| 0.7291666666666666 | 219.309 |
| 0.7298611111111111 | 228.436 |
| 0.7305555555555556 | 242.127 |
| 0.7312500000000001 | 251.251 |
| 0.7319444444444444 | 260.373 |
| 0.7326388888888888 | 269.49 |
| 0.7333333333333334 | 274.047 |
| 0.7340277777777778 | 278.603 |
| 0.7347222222222222 | 278.603 |
| 0.7354166666666666 | 283.156 |
| 0.7361111111111112 | 283.156 |
| 0.7368055555555556 | 283.156 |
| 0.7374999999999999 | 283.156 |
| 0.7381944444444444 | 283.156 |
| 0.7388888888888889 | 283.156 |
| 0.7395833333333334 | 278.603 |
| 0.7402777777777777 | 278.603 |
| 0.7409722222222223 | 274.047 |
| 0.7416666666666667 | 274.047 |
| 0.7423611111111111 | 269.49 |
| 0.7430555555555555 | 264.932 |
| 0.74375 | 264.932 |
| 0.7444444444444445 | 260.373 |
| 0.7451388888888889 | 260.373 |
| 0.7458333333333332 | 255.813 |
| 0.7465277777777778 | 251.251 |
| 0.7472222222222222 | 246.689 |
| 0.7479166666666667 | 242.127 |
| 0.748611111111111 | 242.127 |
| 0.7493055555555556 | 237.564 |
| 0.75 | 233 |
| 0.7506944444444444 | 228.436 |
| 0.751388888888889 | 223.873 |
| 0.7520833333333333 | 223.873 |
| 0.7527777777777778 | 219.309 |
| 0.7534722222222222 | 214.746 |
| 0.7541666666666668 | 210.182 |
| 0.7548611111111111 | 210.182 |
| 0.7555555555555555 | 205.62 |
| 0.75625 | 201.058 |
| 0.7569444444444445 | 201.058 |
| 0.7576388888888889 | 196.497 |
| 0.7583333333333333 | 196.497 |
| 0.7590277777777777 | 191.937 |
| 0.7597222222222223 | 191.937 |
| 0.7604166666666666 | 187.378 |
| 0.7611111111111111 | 187.378 |
| 0.7618055555555556 | 182.82 |
| 0.7625000000000001 | 182.82 |
| 0.7631944444444444 | 178.264 |
| 0.7638888888888888 | 178.264 |
| 0.7645833333333334 | 173.709 |
| 0.7652777777777778 | 173.709 |
| 0.7659722222222222 | 169.156 |
| 0.7666666666666666 | 164.605 |
| 0.7673611111111112 | 164.605 |
| 0.7680555555555556 | 164.605 |
| 0.7687499999999999 | 160.056 |
| 0.7694444444444444 | 160.056 |
| 0.7701388888888889 | 155.509 |
| 0.7708333333333334 | 155.509 |
| 0.7715277777777777 | 155.509 |
| 0.7722222222222223 | 155.509 |
| 0.7729166666666667 | 150.964 |
| 0.7736111111111111 | 146.423 |
| 0.7743055555555555 | 146.423 |
| 0.775 | 146.423 |
| 0.7756944444444445 | 146.423 |
| 0.7763888888888889 | 141.884 |
| 0.7770833333333332 | 141.884 |
| 0.7777777777777778 | 137.347 |
| 0.7784722222222222 | 137.347 |
| 0.7791666666666667 | 137.347 |
| 0.779861111111111 | 137.347 |
| 0.7805555555555556 | 132.814 |
| 0.78125 | 132.814 |
| 0.7819444444444444 | 132.814 |
| 0.782638888888889 | 132.814 |
| 0.7833333333333333 | 128.284 |
| 0.7840277777777778 | 128.284 |
| 0.7847222222222222 | 128.284 |
| 0.7854166666666668 | 123.758 |
| 0.7861111111111111 | 123.758 |
| 0.7868055555555555 | 123.758 |
| 0.7875 | 119.235 |
| 0.7881944444444445 | 119.235 |
| 0.7888888888888889 | 119.235 |
| 0.7895833333333333 | 114.716 |
| 0.7902777777777777 | 114.716 |
| 0.7909722222222223 | 110.201 |
| 0.7916666666666666 | 110.201 |
| 0.7923611111111111 | 105.69 |
| 0.7930555555555556 | 105.69 |
| 0.7937500000000001 | 101.184 |
| 0.7944444444444444 | 101.184 |
| 0.7951388888888888 | 96.682 |
| 0.7958333333333334 | 92.184 |
| 0.7965277777777778 | 87.692 |
| 0.7972222222222222 | 83.205 |
| 0.7979166666666666 | 83.205 |
| 0.7986111111111112 | 83.205 |
| 0.7993055555555556 | 83.205 |
| 0.7999999999999999 | 83.205 |
| 0.8006944444444444 | 83.205 |
| 0.8013888888888889 | 78.722 |
| 0.8020833333333334 | 78.722 |
| 0.8027777777777777 | 78.722 |
| 0.8034722222222223 | 74.246 |
| 0.8041666666666667 | 74.246 |
| 0.8048611111111111 | 74.246 |
| 0.8055555555555555 | 74.246 |
| 0.80625 | 74.246 |
| 0.8069444444444445 | 69.775 |
| 0.8076388888888889 | 69.775 |
| 0.8083333333333332 | 69.775 |
| 0.8090277777777778 | 65.31 |
| 0.8097222222222222 | 65.31 |
| 0.8104166666666667 | 65.31 |
| 0.811111111111111 | 65.31 |
| 0.8118055555555556 | 65.31 |
| 0.8125 | 60.85 |
| 0.8131944444444444 | 60.85 |
| 0.813888888888889 | 60.85 |
| 0.8145833333333333 | 60.85 |
| 0.8152777777777778 | 60.85 |
| 0.8159722222222222 | 56.398 |
| 0.8166666666666668 | 56.398 |
| 0.8173611111111111 | 56.398 |
| 0.8180555555555555 | 56.398 |
| 0.81875 | 51.951 |
| 0.8194444444444445 | 51.951 |
| 0.8201388888888889 | 51.951 |
| 0.8208333333333333 | 47.511 |
| 0.8215277777777777 | 47.511 |
| 0.8222222222222223 | 47.511 |
| 0.8229166666666666 | 43.079 |
| 0.8236111111111111 | 47.511 |
| 0.8243055555555556 | 43.079 |
| 0.8250000000000001 | 43.079 |
| 0.8256944444444444 | 43.079 |
| 0.8263888888888888 | 38.653 |
| 0.8270833333333334 | 38.653 |
| 0.8277777777777778 | 38.653 |
| 0.8284722222222222 | 38.653 |
| 0.8291666666666666 | 34.234 |
| 0.8298611111111112 | 34.234 |
| 0.8305555555555556 | 34.234 |
| 0.8312499999999999 | 29.823 |
| 0.8319444444444444 | 29.823 |
| 0.8326388888888889 | 29.823 |
| 0.8333333333333334 | 29.823 |
| 0.8340277777777777 | 25.419 |
| 0.8347222222222223 | 25.419 |
| 0.8354166666666667 | 25.419 |
| 0.8361111111111111 | 25.419 |
| 0.8368055555555555 | 21.024 |
| 0.8375 | 21.024 |
| 0.8381944444444445 | 21.024 |
| 0.8388888888888889 | 21.024 |
| 0.8395833333333332 | 21.024 |
| 0.8402777777777778 | 16.636 |
| 0.8409722222222222 | 16.636 |
| 0.8416666666666667 | 12.257 |
| 0.842361111111111 | 12.257 |
| 0.8430555555555556 | 12.257 |
| 0.84375 | 12.257 |
| 0.8444444444444444 | 7.887 |
| 0.845138888888889 | 7.887 |
| 0.8458333333333333 | 7.887 |
| 0.8465277777777778 | 3.525 |
| 0.8472222222222222 | 3.525 |
| 0.8479166666666668 | 3.525 |
| 0.8486111111111111 | 3.525 |
| 0.8493055555555555 | 3.525 |
| 0.85 | 3.525 |
| 0.8506944444444445 | 0 |
| 0.8513888888888889 | 0 |
| 0.8520833333333333 | 0 |
| 0.8527777777777777 | 0 |
| 0.8534722222222223 | 0 |
| 0.8541666666666666 | 0 |
| 0.8548611111111111 | 0 |
| 0.8555555555555556 | 0 |
| 0.8562500000000001 | 0 |
| 0.8569444444444444 | 0 |
| 0.8576388888888888 | 0 |
| 0.8583333333333334 | 0 |
| 0.8590277777777778 | 0 |
| 0.8597222222222222 | 0 |
| 0.8604166666666666 | 0 |
| 0.8611111111111112 | 0 |
| 0.8618055555555556 | 0 |
| 0.8624999999999999 | 0 |
| 0.8631944444444444 | 0 |
| 0.8638888888888889 | 0 |
| 0.8645833333333334 | 0 |
| 0.8652777777777777 | 0 |
| 0.8659722222222223 | 0 |
| 0.8666666666666667 | 0 |
| 0.8673611111111111 | 0 |
| 0.8680555555555555 | 0 |
| 0.86875 | 0 |
| 0.8694444444444445 | 0 |
| 0.8701388888888889 | 0 |
| 0.8708333333333332 | 0 |
| 0.8715277777777778 | 0 |
| 0.8722222222222222 | 0 |
| 0.8729166666666667 | 0 |
| 0.873611111111111 | 0 |
| 0.8743055555555556 | 0 |
| 0.875 | 0 |
| 0.8756944444444444 | 0 |
| 0.876388888888889 | 0 |
| 0.8770833333333333 | 0 |
| 0.8777777777777778 | 0 |
| 0.8784722222222222 | 0 |
| 0.8791666666666668 | 0 |
| 0.8798611111111111 | 0 |
| 0.8805555555555555 | 0 |
| 0.88125 | 0 |
| 0.8819444444444445 | 0 |
| 0.8826388888888889 | 0 |
| 0.8833333333333333 | 0 |
| 0.8840277777777777 | 0 |
| 0.8847222222222223 | 0 |
| 0.8854166666666666 | 0 |
| 0.8861111111111111 | 0 |
| 0.8868055555555556 | 0 |
| 0.8875000000000001 | 0 |
| 0.8881944444444444 | 0 |
| 0.8888888888888888 | 0 |
| 0.8895833333333334 | 0 |
| 0.8902777777777778 | 0 |
| 0.8909722222222222 | 0 |
| 0.8916666666666666 | 0 |
| 0.8923611111111112 | 0 |
| 0.8930555555555556 | 0 |
| 0.8937499999999999 | 0 |
| 0.8944444444444444 | 0 |
| 0.8951388888888889 | 0 |
| 0.8958333333333334 | 0 |
| 0.8965277777777777 | 0 |
| 0.8972222222222223 | 0 |
| 0.8979166666666667 | 0 |
| 0.8986111111111111 | 0 |
| 0.8993055555555555 | 0 |
| 0.9 | 0 |
| 0.9006944444444445 | 0 |
| 0.9013888888888889 | 0 |
| 0.9020833333333332 | 0 |
| 0.9027777777777778 | 0 |
| 0.9034722222222222 | 0 |
| 0.9041666666666667 | 0 |
| 0.904861111111111 | 0 |
| 0.9055555555555556 | 0 |
| 0.90625 | 0 |
| 0.9069444444444444 | 0 |
| 0.907638888888889 | 0 |
| 0.9083333333333333 | 0 |
| 0.9090277777777778 | 0 |
| 0.9097222222222222 | 0 |
| 0.9104166666666668 | 0 |
| 0.9111111111111111 | 0 |
| 0.9118055555555555 | 0 |
| 0.9125 | 0 |
| 0.9131944444444445 | 0 |
| 0.9138888888888889 | 0 |
| 0.9145833333333333 | 0 |
| 0.9152777777777777 | 0 |
| 0.9159722222222223 | 0 |
| 0.9166666666666666 | 0 |
| 0.9173611111111111 | 0 |
| 0.9180555555555556 | 0 |
| 0.9187500000000001 | 0 |
| 0.9194444444444444 | 0 |
| 0.9201388888888888 | 0 |
| 0.9208333333333334 | 0 |
| 0.9215277777777778 | 0 |
| 0.9222222222222222 | 0 |
| 0.9229166666666666 | 0 |
| 0.9236111111111112 | 0 |
| 0.9243055555555556 | 0 |
| 0.9249999999999999 | 0 |
| 0.9256944444444444 | 0 |
| 0.9263888888888889 | 0 |
| 0.9270833333333334 | 0 |
| 0.9277777777777777 | 0 |
| 0.9284722222222223 | 0 |
| 0.9291666666666667 | 0 |
| 0.9298611111111111 | 0 |
| 0.9305555555555555 | 0 |
| 0.93125 | 0 |
| 0.9319444444444445 | 0 |
| 0.9326388888888889 | 0 |
| 0.9333333333333332 | 0 |
| 0.9340277777777778 | 0 |
| 0.9347222222222222 | 0 |
| 0.9354166666666667 | 0 |
| 0.936111111111111 | 0 |
| 0.9368055555555556 | 0 |
| 0.9375 | 0 |
| 0.9381944444444444 | 0 |
| 0.938888888888889 | 0 |
| 0.9395833333333333 | 0 |
| 0.9402777777777778 | 0 |
| 0.9409722222222222 | 0 |
| 0.9416666666666668 | 0 |
| 0.9423611111111111 | 0 |
| 0.9430555555555555 | 0 |
| 0.94375 | 0 |
| 0.9444444444444445 | 0 |
| 0.9451388888888889 | 0 |
| 0.9458333333333333 | 0 |
| 0.9465277777777777 | 0 |
| 0.9472222222222223 | 0 |
| 0.9479166666666666 | 0 |
| 0.9486111111111111 | 0 |
| 0.9493055555555556 | 0 |
| 0.9500000000000001 | 0 |
| 0.9506944444444444 | 0 |
| 0.9513888888888888 | 0 |
| 0.9520833333333334 | 0 |
| 0.9527777777777778 | 0 |
| 0.9534722222222222 | 0 |
| 0.9541666666666666 | 0 |
| 0.9548611111111112 | 0 |
| 0.9555555555555556 | 0 |
| 0.9562499999999999 | 0 |
| 0.9569444444444444 | 0 |
| 0.9576388888888889 | 0 |
| 0.9583333333333334 | 0 |
| 0.9590277777777777 | 0 |
| 0.9597222222222223 | 0 |
| 0.9604166666666667 | 0 |
| 0.9611111111111111 | 0 |
| 0.9618055555555555 | 0 |
| 0.9625 | 0 |
| 0.9631944444444445 | 0 |
| 0.9638888888888889 | 0 |
| 0.9645833333333332 | 0 |
| 0.9652777777777778 | 0 |
| 0.9659722222222222 | 0 |
| 0.9666666666666667 | 0 |
| 0.967361111111111 | 0 |
| 0.9680555555555556 | 0 |
| 0.96875 | 0 |
| 0.9694444444444444 | 0 |
| 0.970138888888889 | 0 |
| 0.9708333333333333 | 0 |
| 0.9715277777777778 | 0 |
| 0.9722222222222222 | 0 |
| 0.9729166666666668 | 0 |
| 0.9736111111111111 | 0 |
| 0.9743055555555555 | 0 |
| 0.975 | 0 |
| 0.9756944444444445 | 0 |
| 0.9763888888888889 | 0 |
| 0.9770833333333333 | 0 |
| 0.9777777777777777 | 0 |
| 0.9784722222222223 | 0 |
| 0.9791666666666666 | 0 |
| 0.9798611111111111 | 0 |
| 0.9805555555555556 | 0 |
| 0.9812500000000001 | 0 |
| 0.9819444444444444 | 0 |
| 0.9826388888888888 | 0 |
| 0.9833333333333334 | 0 |
| 0.9840277777777778 | 0 |
| 0.9847222222222222 | 0 |
| 0.9854166666666666 | 0 |
| 0.9861111111111112 | 0 |
| 0.9868055555555556 | 0 |
| 0.9874999999999999 | 0 |
| 0.9881944444444444 | 0 |
| 0.9888888888888889 | 0 |
| 0.9895833333333334 | 0 |
| 0.9902777777777777 | 0 |
| 0.9909722222222223 | 0 |
| 0.9916666666666667 | 0 |
| 0.9923611111111111 | 0 |
| 0.9930555555555555 | 0 |
| 0.99375 | 0 |
| 0.9944444444444445 | 0 |
| 0.9951388888888889 | 0 |
| 0.9958333333333332 | 0 |
| 0.9965277777777778 | 0 |
| 0.9972222222222222 | 0 |
| 0.9979166666666667 | 0 |
| 0.998611111111111 | 0 |
| 0.9993055555555556 | 0 |